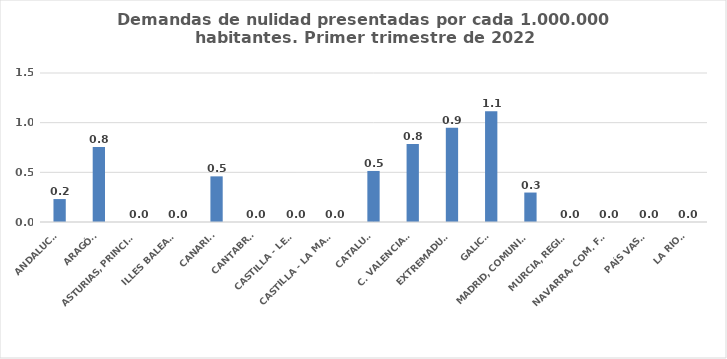
| Category | Series 0 |
|---|---|
| ANDALUCÍA | 0.231 |
| ARAGÓN | 0.755 |
| ASTURIAS, PRINCIPADO | 0 |
| ILLES BALEARS | 0 |
| CANARIAS | 0.459 |
| CANTABRIA | 0 |
| CASTILLA - LEÓN | 0 |
| CASTILLA - LA MANCHA | 0 |
| CATALUÑA | 0.514 |
| C. VALENCIANA | 0.786 |
| EXTREMADURA | 0.949 |
| GALICIA | 1.116 |
| MADRID, COMUNIDAD | 0.297 |
| MURCIA, REGIÓN | 0 |
| NAVARRA, COM. FORAL | 0 |
| PAÍS VASCO | 0 |
| LA RIOJA | 0 |